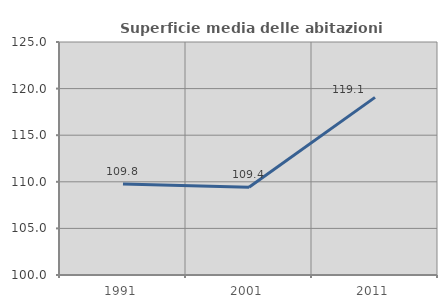
| Category | Superficie media delle abitazioni occupate |
|---|---|
| 1991.0 | 109.775 |
| 2001.0 | 109.414 |
| 2011.0 | 119.061 |